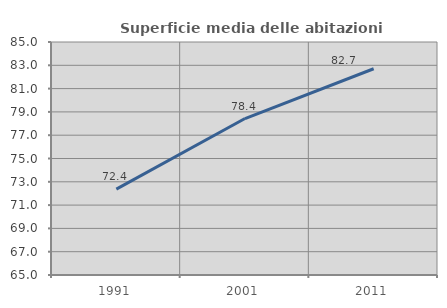
| Category | Superficie media delle abitazioni occupate |
|---|---|
| 1991.0 | 72.368 |
| 2001.0 | 78.431 |
| 2011.0 | 82.705 |